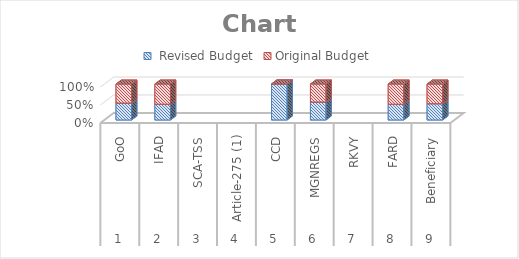
| Category |  Revised Budget | Original Budget |
|---|---|---|
| 0 | 185270167 | 207729167 |
| 1 | 527690828 | 674757228 |
| 2 | 0 | 0 |
| 3 | 0 | 0 |
| 4 | 9665000 | 0 |
| 5 | 120401800 | 120401800 |
| 6 | 0 | 0 |
| 7 | 79831000 | 102320000 |
| 8 | 35458040 | 42756140 |